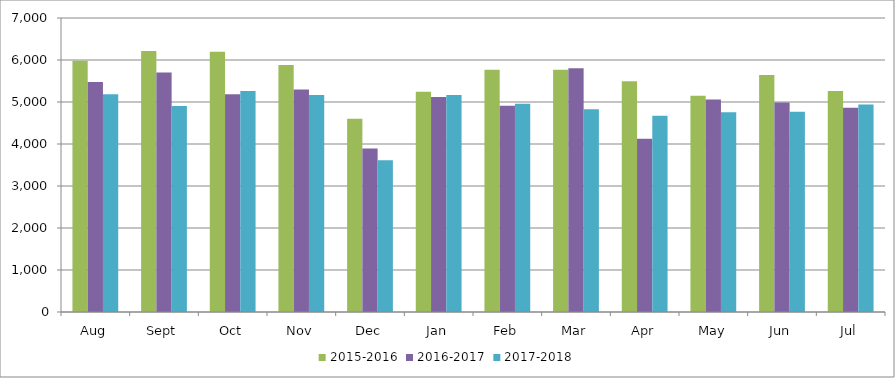
| Category | 2015-2016 | 2016-2017 | 2017-2018 |
|---|---|---|---|
| Aug | 5985 | 5474 | 5187 |
| Sept | 6215 | 5700 | 4907 |
| Oct | 6198 | 5184 | 5259 |
| Nov | 5881 | 5297 | 5167 |
| Dec | 4599 | 3894 | 3612 |
| Jan | 5242 | 5119 | 5164 |
| Feb | 5769 | 4908 | 4960 |
| Mar | 5766 | 5804 | 4827 |
| Apr | 5493 | 4124 | 4673 |
| May | 5149 | 5059 | 4757 |
| Jun | 5641 | 4986 | 4768 |
| Jul | 5261 | 4866 | 4942 |